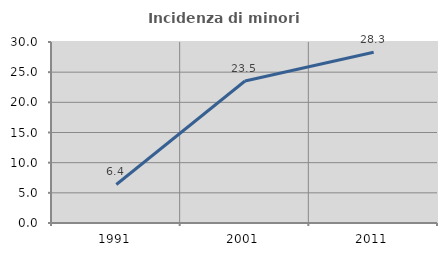
| Category | Incidenza di minori stranieri |
|---|---|
| 1991.0 | 6.383 |
| 2001.0 | 23.529 |
| 2011.0 | 28.304 |